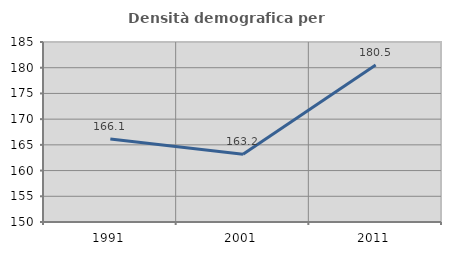
| Category | Densità demografica |
|---|---|
| 1991.0 | 166.139 |
| 2001.0 | 163.174 |
| 2011.0 | 180.539 |